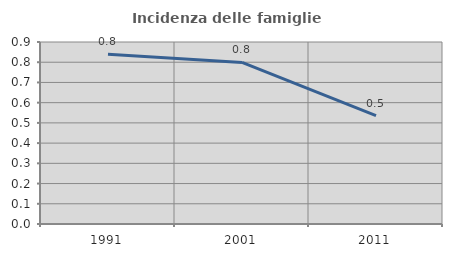
| Category | Incidenza delle famiglie numerose |
|---|---|
| 1991.0 | 0.839 |
| 2001.0 | 0.799 |
| 2011.0 | 0.536 |